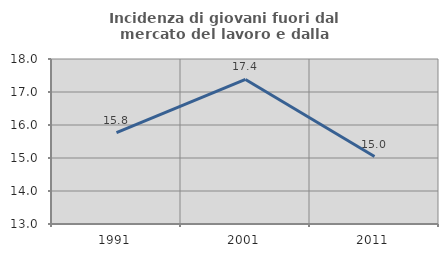
| Category | Incidenza di giovani fuori dal mercato del lavoro e dalla formazione  |
|---|---|
| 1991.0 | 15.767 |
| 2001.0 | 17.381 |
| 2011.0 | 15.045 |